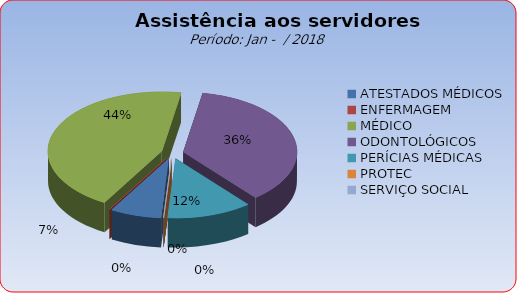
| Category | Series 0 |
|---|---|
| ATESTADOS MÉDICOS | 7.258 |
| ENFERMAGEM | 0 |
| MÉDICO | 44.355 |
| ODONTOLÓGICOS | 36.29 |
| PERÍCIAS MÉDICAS | 12.097 |
| PROTEC | 0 |
| SERVIÇO SOCIAL | 0 |